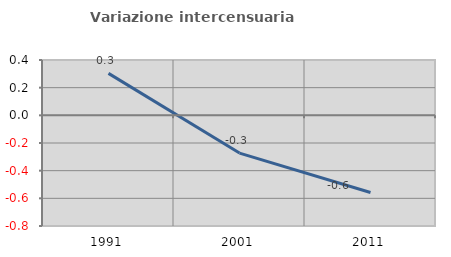
| Category | Variazione intercensuaria annua |
|---|---|
| 1991.0 | 0.303 |
| 2001.0 | -0.273 |
| 2011.0 | -0.558 |